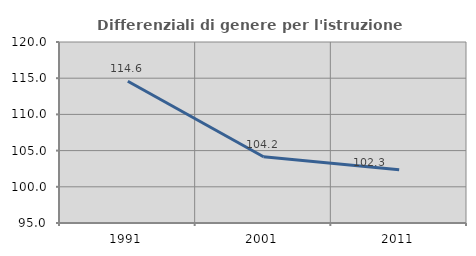
| Category | Differenziali di genere per l'istruzione superiore |
|---|---|
| 1991.0 | 114.574 |
| 2001.0 | 104.154 |
| 2011.0 | 102.348 |